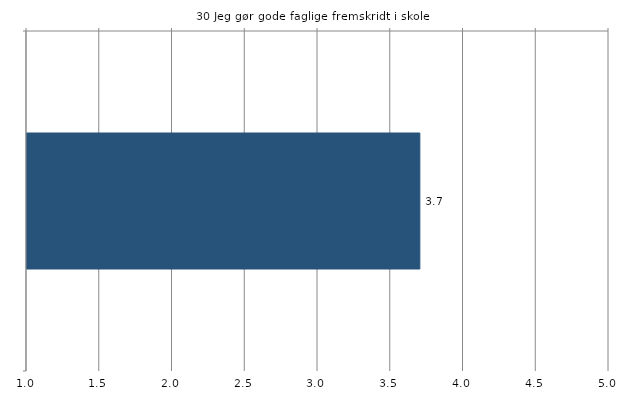
| Category | Gns. |
|---|---|
|   | 3.7 |